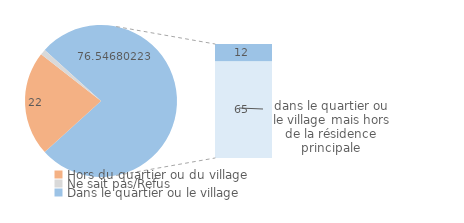
| Category | Series 0 |
|---|---|
| Hors du quartier ou du village | 22.27 |
| Ne sait pas/Refus | 1.183 |
| Dans le quartier ou le village | 11.779 |